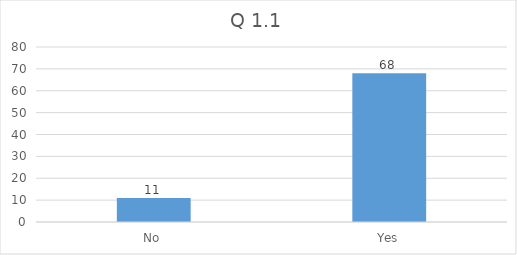
| Category | Total |
|---|---|
| No | 11 |
| Yes | 68 |